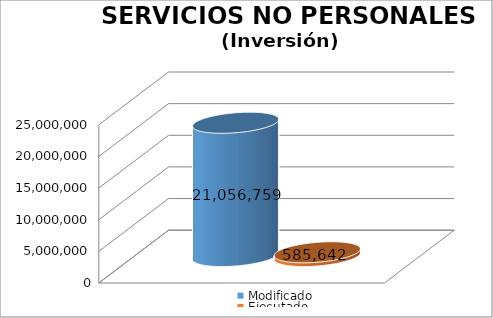
| Category | Modificado | Ejecutado |
|---|---|---|
| 0 | 21056759 | 585641.5 |